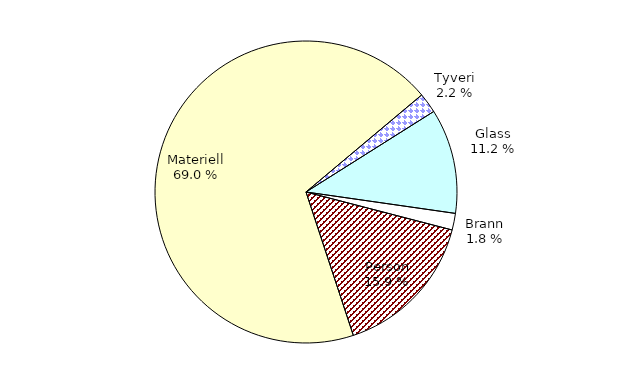
| Category | Series 0 |
|---|---|
| Tyveri | 208.458 |
| Glass | 1083.353 |
| Brann | 172.108 |
| Person | 1533.241 |
| Materiell | 6659.548 |